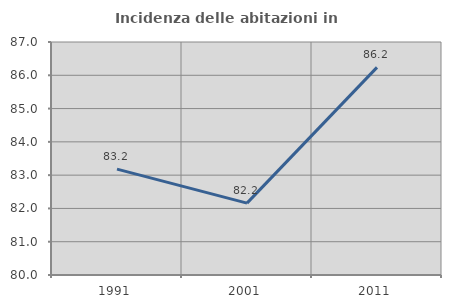
| Category | Incidenza delle abitazioni in proprietà  |
|---|---|
| 1991.0 | 83.182 |
| 2001.0 | 82.16 |
| 2011.0 | 86.239 |